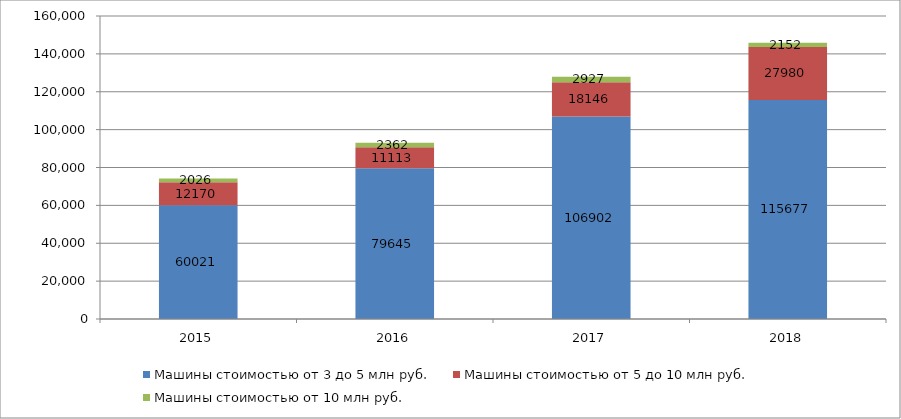
| Category | Машины стоимостью от 3 до 5 млн руб. | Машины стоимостью от 5 до 10 млн руб. | Машины стоимостью от 10 млн руб. |
|---|---|---|---|
| 2015.0 | 60021 | 12170 | 2026 |
| 2016.0 | 79645 | 11113 | 2362 |
| 2017.0 | 106902 | 18146 | 2927 |
| 2018.0 | 115677 | 27980 | 2152 |